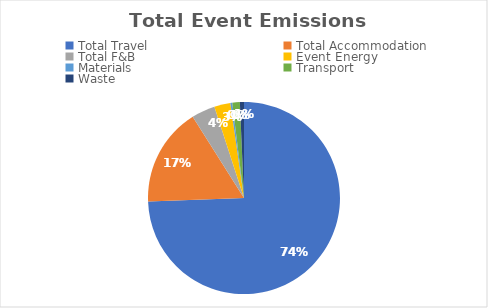
| Category | Series 0 |
|---|---|
| Total Travel | 41.67 |
| Total Accommodation | 9.294 |
| Total F&B | 2.228 |
| Event Energy | 1.52 |
| Materials | 0.182 |
| Transport | 0.704 |
| Waste | 0.388 |